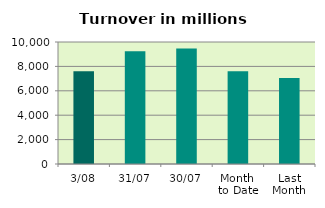
| Category | Series 0 |
|---|---|
| 3/08 | 7607.475 |
| 31/07 | 9233.965 |
| 30/07 | 9475.631 |
| Month 
to Date | 7607.475 |
| Last
Month | 7041.386 |